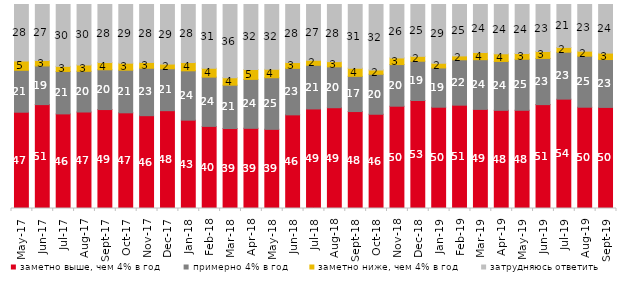
| Category | заметно выше, чем 4% в год | примерно 4% в год | заметно ниже, чем 4% в год | затрудняюсь ответить |
|---|---|---|---|---|
| 2017-05-01 | 47.2 | 20.55 | 4.55 | 27.7 |
| 2017-06-01 | 50.9 | 18.95 | 2.65 | 27.45 |
| 2017-07-01 | 46.35 | 20.8 | 2.5 | 30.3 |
| 2017-08-01 | 47.3 | 19.95 | 3.1 | 29.65 |
| 2017-09-01 | 48.5 | 19.5 | 3.55 | 28.45 |
| 2017-10-01 | 46.9 | 20.9 | 3.45 | 28.75 |
| 2017-11-01 | 45.5 | 23.25 | 2.85 | 28.4 |
| 2017-12-01 | 47.95 | 20.55 | 2.3 | 29.2 |
| 2018-01-01 | 43.3 | 24.2 | 4.05 | 28.45 |
| 2018-02-01 | 40.25 | 24.15 | 4.35 | 31.25 |
| 2018-03-01 | 39.2 | 21.25 | 3.7 | 35.85 |
| 2018-04-01 | 39.3 | 24 | 4.85 | 31.85 |
| 2018-05-01 | 38.8 | 25.3 | 4.15 | 31.75 |
| 2018-06-01 | 45.9 | 22.8 | 2.85 | 28.45 |
| 2018-07-01 | 48.8 | 21.4 | 2.45 | 27.35 |
| 2018-08-01 | 49.4 | 20.05 | 2.55 | 28 |
| 2018-09-01 | 47.5 | 17.25 | 4 | 31.2 |
| 2018-10-01 | 46.2 | 19.6 | 2.15 | 32.05 |
| 2018-11-01 | 50.15 | 20.409 | 3.244 | 26.198 |
| 2018-12-01 | 52.95 | 19.25 | 2.4 | 25.4 |
| 2019-01-01 | 49.65 | 19.25 | 2.3 | 28.8 |
| 2019-02-01 | 50.65 | 22.25 | 1.9 | 25.2 |
| 2019-03-01 | 48.583 | 24.366 | 3.531 | 23.521 |
| 2019-04-01 | 48.119 | 23.96 | 3.762 | 24.158 |
| 2019-05-01 | 48.143 | 25.012 | 2.823 | 24.022 |
| 2019-06-01 | 50.923 | 22.643 | 3.392 | 23.042 |
| 2019-07-01 | 53.614 | 23.02 | 2.327 | 21.04 |
| 2019-08-01 | 49.65 | 25.025 | 2.448 | 22.877 |
| 2019-09-01 | 49.554 | 23.465 | 3.168 | 23.812 |